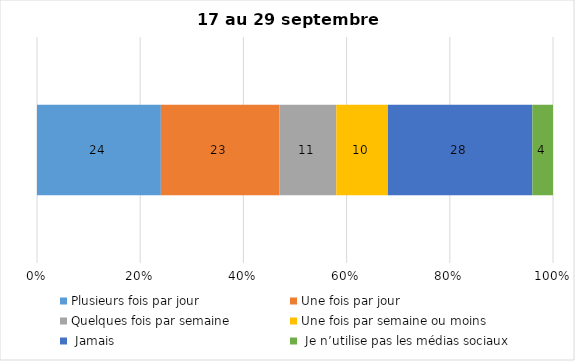
| Category | Plusieurs fois par jour | Une fois par jour | Quelques fois par semaine   | Une fois par semaine ou moins   |  Jamais   |  Je n’utilise pas les médias sociaux |
|---|---|---|---|---|---|---|
| 0 | 24 | 23 | 11 | 10 | 28 | 4 |